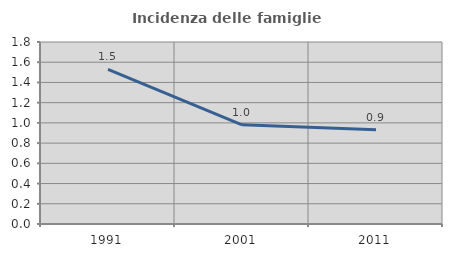
| Category | Incidenza delle famiglie numerose |
|---|---|
| 1991.0 | 1.529 |
| 2001.0 | 0.981 |
| 2011.0 | 0.932 |